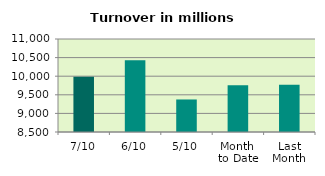
| Category | Series 0 |
|---|---|
| 7/10 | 9987.215 |
| 6/10 | 10428.275 |
| 5/10 | 9374.394 |
| Month 
to Date | 9756.782 |
| Last
Month | 9769.37 |